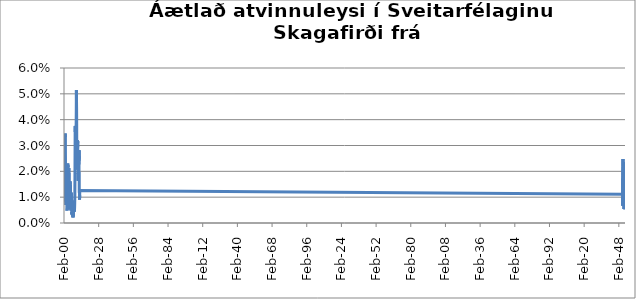
| Category | Series 0 |
|---|---|
| 2000-02-01 | 0.031 |
| 2000-03-01 | 0.03 |
| 2000-04-01 | 0.029 |
| 2000-05-01 | 0.023 |
| 2000-06-01 | 0.018 |
| 2000-07-01 | 0.017 |
| 2000-08-01 | 0.014 |
| 2000-09-01 | 0.009 |
| 2000-10-01 | 0.011 |
| 2000-11-01 | 0.024 |
| 2000-12-01 | 0.029 |
| 2001-01-01 | 0.035 |
| 2001-02-01 | 0.033 |
| 2001-03-01 | 0.028 |
| 2001-04-01 | 0.025 |
| 2001-05-01 | 0.016 |
| 2001-06-01 | 0.01 |
| 2001-07-01 | 0.012 |
| 2001-08-01 | 0.008 |
| 2001-09-01 | 0.007 |
| 2001-10-01 | 0.01 |
| 2001-11-01 | 0.013 |
| 2001-12-01 | 0.017 |
| 2002-01-01 | 0.016 |
| 2002-02-01 | 0.016 |
| 2002-03-01 | 0.018 |
| 2002-04-01 | 0.018 |
| 2002-05-01 | 0.014 |
| 2002-06-01 | 0.009 |
| 2002-07-01 | 0.005 |
| 2002-08-01 | 0.005 |
| 2002-09-01 | 0.006 |
| 2002-10-01 | 0.012 |
| 2002-11-01 | 0.015 |
| 2002-12-01 | 0.018 |
| 2003-01-01 | 0.022 |
| 2003-02-01 | 0.023 |
| 2003-03-01 | 0.022 |
| 2003-04-01 | 0.022 |
| 2003-05-01 | 0.016 |
| 2003-06-01 | 0.008 |
| 2003-07-01 | 0.007 |
| 2003-08-01 | 0.013 |
| 2003-09-01 | 0.014 |
| 2003-10-01 | 0.008 |
| 2003-11-01 | 0.011 |
| 2003-12-01 | 0.013 |
| 2004-01-01 | 0.021 |
| 2004-02-01 | 0.021 |
| 2004-03-01 | 0.02 |
| 2004-04-01 | 0.019 |
| 2004-05-01 | 0.017 |
| 2004-06-01 | 0.013 |
| 2004-07-01 | 0.012 |
| 2004-08-01 | 0.005 |
| 2004-09-01 | 0.006 |
| 2004-10-01 | 0.008 |
| 2004-11-01 | 0.009 |
| 2004-12-01 | 0.013 |
| 2005-01-01 | 0.016 |
| 2005-02-01 | 0.015 |
| 2005-03-01 | 0.012 |
| 2005-04-01 | 0.015 |
| 2005-05-01 | 0.013 |
| 2005-06-01 | 0.01 |
| 2005-07-01 | 0.008 |
| 2005-08-01 | 0.006 |
| 2005-09-01 | 0.005 |
| 2005-10-01 | 0.008 |
| 2005-11-01 | 0.012 |
| 2005-12-01 | 0.01 |
| 2006-01-01 | 0.011 |
| 2006-02-01 | 0.011 |
| 2006-03-01 | 0.01 |
| 2006-04-01 | 0.009 |
| 2006-05-01 | 0.006 |
| 2006-06-01 | 0.003 |
| 2006-07-01 | 0.004 |
| 2006-08-01 | 0.003 |
| 2006-09-01 | 0.003 |
| 2006-10-01 | 0.004 |
| 2006-11-01 | 0.004 |
| 2006-12-01 | 0.004 |
| 2007-01-01 | 0.004 |
| 2007-02-01 | 0.006 |
| 2007-03-01 | 0.004 |
| 2007-04-01 | 0.003 |
| 2007-05-01 | 0.006 |
| 2007-06-01 | 0.002 |
| 2007-07-01 | 0.004 |
| 2007-08-01 | 0.004 |
| 2007-09-01 | 0.005 |
| 2007-10-01 | 0.004 |
| 2007-11-01 | 0.006 |
| 2007-12-01 | 0.006 |
| 2008-01-01 | 0.008 |
| 2008-02-01 | 0.009 |
| 2008-03-01 | 0.008 |
| 2008-04-01 | 0.007 |
| 2008-05-01 | 0.007 |
| 2008-06-01 | 0.006 |
| 2008-07-01 | 0.004 |
| 2008-08-01 | 0.005 |
| 2008-09-01 | 0.006 |
| 2008-10-01 | 0.008 |
| 2008-11-01 | 0.011 |
| 2008-12-01 | 0.017 |
| 2009-01-01 | 0.026 |
| 2009-02-01 | 0.036 |
| 2009-03-01 | 0.037 |
| 2009-04-01 | 0.038 |
| 2009-05-01 | 0.029 |
| 2009-06-01 | 0.026 |
| 2009-07-01 | 0.024 |
| 2009-08-01 | 0.022 |
| 2009-09-01 | 0.021 |
| 2009-10-01 | 0.031 |
| 2009-11-01 | 0.036 |
| 2009-12-01 | 0.039 |
| 2010-01-01 | 0.044 |
| 2010-02-01 | 0.051 |
| 2010-03-01 | 0.048 |
| 2010-04-01 | 0.045 |
| 2010-05-01 | 0.038 |
| 2010-06-01 | 0.024 |
| 2010-07-01 | 0.024 |
| 2010-08-01 | 0.024 |
| 2010-09-01 | 0.026 |
| 2010-10-01 | 0.027 |
| 2010-11-01 | 0.031 |
| 2010-12-01 | 0.03 |
| 2011-01-01 | 0.032 |
| 2011-02-01 | 0.031 |
| 2011-03-01 | 0.032 |
| 2011-04-01 | 0.029 |
| 2011-05-01 | 0.022 |
| 2011-06-01 | 0.021 |
| 2011-07-01 | 0.016 |
| 2011-08-01 | 0.019 |
| 2011-09-01 | 0.019 |
| 2011-10-01 | 0.02 |
| 2011-11-01 | 0.023 |
| 2011-12-01 | 0.026 |
| 2012-01-01 | 0.024 |
| 2012-02-01 | 0.024 |
| 2012-03-01 | 0.028 |
| 2012-04-01 | 0.023 |
| 2012-05-01 | 0.018 |
| 2012-06-01 | 0.012 |
| 2012-07-01 | 0.012 |
| 2012-08-01 | 0.013 |
| 2012-09-01 | 0.009 |
| 2012-10-01 | 0.011 |
| 2012-11-01 | 0.013 |
| 2012-12-01 | 0.013 |
| 201301.0 | 0.011 |
| 201302.0 | 0.014 |
| 201303.0 | 0.016 |
| 201304.0 | 0.015 |
| 201305.0 | 0.012 |
| 201306.0 | 0.009 |
| 201307.0 | 0.008 |
| 201308.0 | 0.008 |
| 201309.0 | 0.007 |
| 201310.0 | 0.008 |
| 201311.0 | 0.007 |
| 201312.0 | 0.01 |
| 201401.0 | 0.018 |
| 201402.0 | 0.025 |
| 201403.0 | 0.022 |
| 201404.0 | 0.019 |
| 201405.0 | 0.015 |
| 201406.0 | 0.016 |
| 201407.0 | 0.017 |
| 201408.0 | 0.014 |
| 201409.0 | 0.017 |
| 201410.0 | 0.019 |
| 201411.0 | 0.02 |
| 201412.0 | 0.02 |
| 201501.0 | 0.022 |
| 201502.0 | 0.018 |
| 201503.0 | 0.017 |
| 201504.0 | 0.016 |
| 201505.0 | 0.014 |
| 201506.0 | 0.011 |
| 201507.0 | 0.012 |
| 201508.0 | 0.014 |
| 201509.0 | 0.014 |
| 201510.0 | 0.015 |
| 201511.0 | 0.015 |
| 201512.0 | 0.018 |
| 201601.0 | 0.018 |
| 201602.0 | 0.018 |
| 201603.0 | 0.016 |
| 201604.0 | 0.013 |
| 201605.0 | 0.01 |
| 201606.0 | 0.009 |
| 201607.0 | 0.013 |
| 201608.0 | 0.011 |
| 201609.0 | 0.009 |
| 201610.0 | 0.01 |
| 201611.0 | 0.015 |
| 201612.0 | 0.018 |
| 201701.0 | 0.024 |
| 201702.0 | 0.022 |
| 201703.0 | 0.018 |
| 201704.0 | 0.013 |
| 201705.0 | 0.011 |
| 201706.0 | 0.008 |
| 201707.0 | 0.006 |
| 201708.0 | 0.005 |
| 201709.0 | 0.007 |
| 201710.0 | 0.009 |
| 201711.0 | 0.009 |
| 201712.0 | 0.009 |
| 201801.0 | 0.014 |
| 201802.0 | 0.013 |
| 201803.0 | 0.011 |
| 201804.0 | 0.012 |
| 201805.0 | 0.008 |
| 201806.0 | 0.008 |
| 201807.0 | 0.009 |
| 201808.0 | 0.007 |
| 201809.0 | 0.011 |
| 201810.0 | 0.012 |
| 201811.0 | 0.011 |
| 201812.0 | 0.012 |
| 201901.0 | 0.011 |
| 201902.0 | 0.011 |
| 201903.0 | 0.01 |
| 201904.0 | 0.008 |
| 201905.0 | 0.009 |
| 201906.0 | 0.007 |
| 201907.0 | 0.007 |
| 201908.0 | 0.006 |
| 201909.0 | 0.005 |
| 201910.0 | 0.012 |
| 201911.0 | 0.014 |
| 201912.0 | 0.016 |
| 202001.0 | 0.02 |
| 202002.0 | 0.019 |